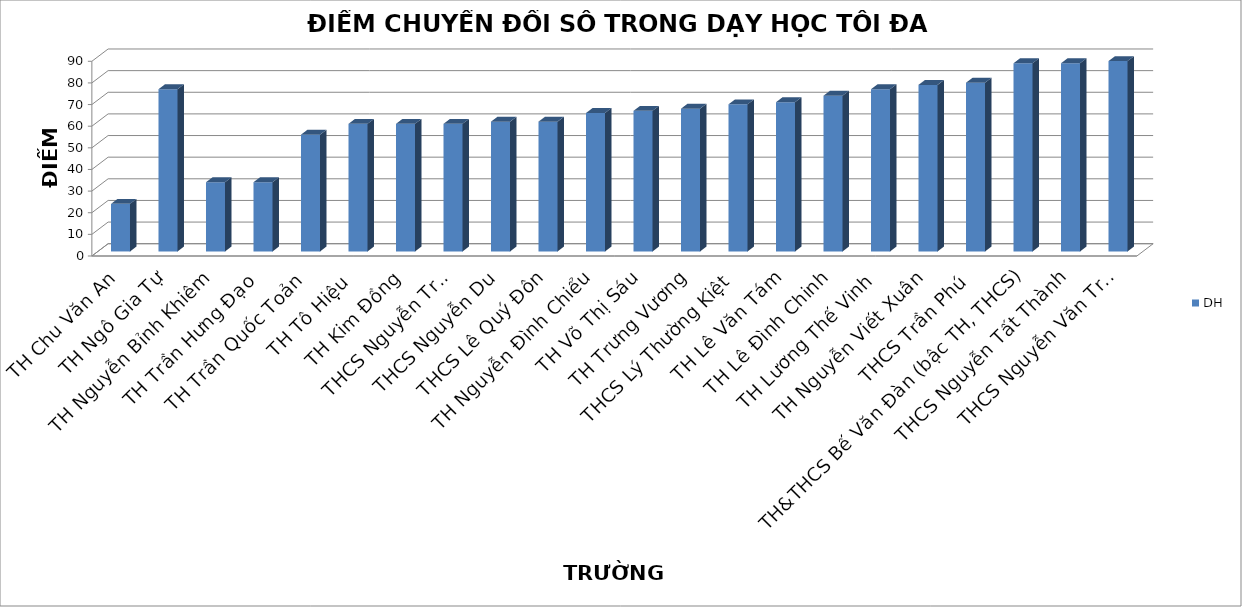
| Category | DH |
|---|---|
| TH Chu Văn An | 22 |
| TH Ngô Gia Tự | 75 |
| TH Nguyễn Bỉnh Khiêm | 32 |
| TH Trần Hưng Đạo | 32 |
| TH Trần Quốc Toản | 54 |
| TH Tô Hiệu | 59 |
| TH Kim Đồng | 59 |
| THCS Nguyễn Trãi | 59 |
| THCS Nguyễn Du | 60 |
| THCS Lê Quý Đôn | 60 |
| TH Nguyễn Đình Chiểu | 64 |
| TH Võ Thị Sáu | 65 |
| TH Trưng Vương | 66 |
| THCS Lý Thường Kiệt | 68 |
| TH Lê Văn Tám | 69 |
| TH Lê Đình Chinh | 72 |
| TH Lương Thế Vinh | 75 |
| TH Nguyễn Viết Xuân | 77 |
| THCS Trần Phú | 78 |
| TH&THCS Bế Văn Đàn (bậc TH, THCS) | 87 |
| THCS Nguyễn Tất Thành | 87 |
| THCS Nguyễn Văn Trỗi | 88 |